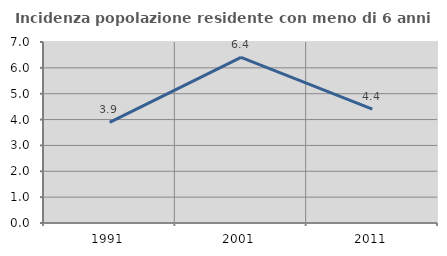
| Category | Incidenza popolazione residente con meno di 6 anni |
|---|---|
| 1991.0 | 3.889 |
| 2001.0 | 6.408 |
| 2011.0 | 4.405 |